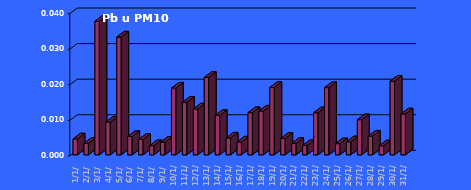
| Category | Pb u PM10 [µg/m3] |
|---|---|
| 2023-01-01 | 0.004 |
| 2023-01-02 | 0.003 |
| 2023-01-03 | 0.038 |
| 2023-01-04 | 0.009 |
| 2023-01-05 | 0.033 |
| 2023-01-06 | 0.005 |
| 2023-01-07 | 0.004 |
| 2023-01-08 | 0.003 |
| 2023-01-09 | 0.004 |
| 2023-01-10 | 0.019 |
| 2023-01-11 | 0.015 |
| 2023-01-12 | 0.013 |
| 2023-01-13 | 0.022 |
| 2023-01-14 | 0.011 |
| 2023-01-15 | 0.005 |
| 2023-01-16 | 0.004 |
| 2023-01-17 | 0.012 |
| 2023-01-18 | 0.012 |
| 2023-01-19 | 0.019 |
| 2023-01-20 | 0.005 |
| 2023-01-21 | 0.003 |
| 2023-01-22 | 0.003 |
| 2023-01-23 | 0.012 |
| 2023-01-24 | 0.019 |
| 2023-01-25 | 0.003 |
| 2023-01-26 | 0.004 |
| 2023-01-27 | 0.01 |
| 2023-01-28 | 0.005 |
| 2023-01-29 | 0.003 |
| 2023-01-30 | 0.021 |
| 2023-01-31 | 0.011 |